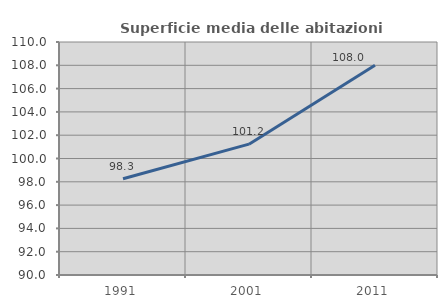
| Category | Superficie media delle abitazioni occupate |
|---|---|
| 1991.0 | 98.26 |
| 2001.0 | 101.229 |
| 2011.0 | 107.998 |